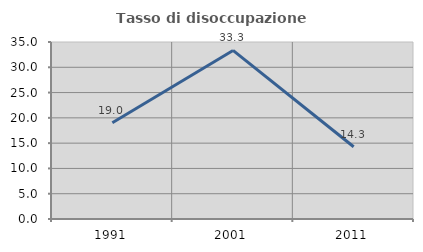
| Category | Tasso di disoccupazione giovanile  |
|---|---|
| 1991.0 | 19.048 |
| 2001.0 | 33.333 |
| 2011.0 | 14.286 |